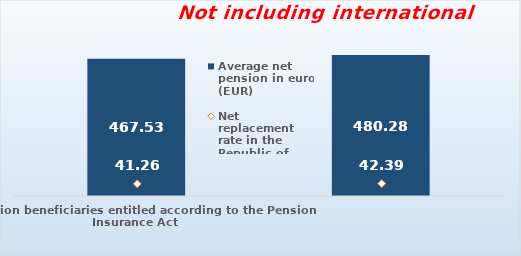
| Category | Average net pension in euros (EUR)  |
|---|---|
| Pension beneficiaries entitled according to the Pension Insurance Act   | 467.53 |
| Pension beneficiaries entitled to pension FOR THE FIRST TIME in 2023 according to the Pension Insurance Act  - NEW BENEFICIARIES | 480.28 |